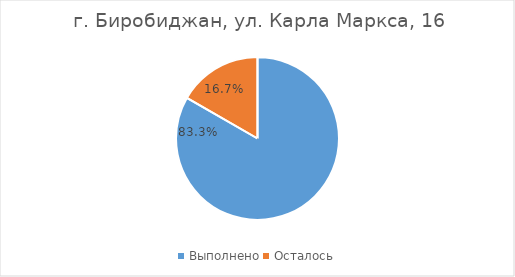
| Category |  г. Биробиджан, ул. Карла Маркса, 16 |
|---|---|
| Выполнено | 0.833 |
| Осталось | 0.167 |